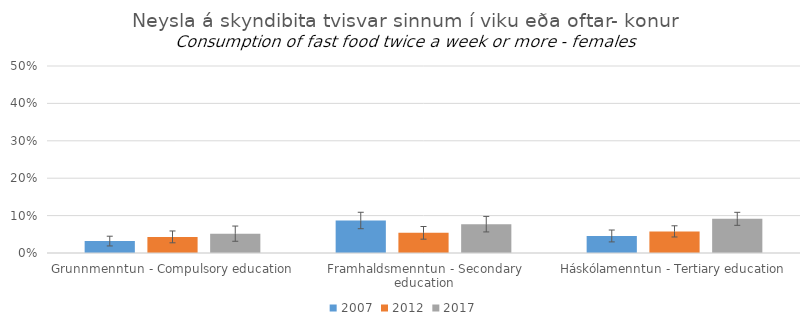
| Category | 2007 | 2012 | 2017 |
|---|---|---|---|
| Grunnmenntun - Compulsory education | 0.032 | 0.043 | 0.052 |
| Framhaldsmenntun - Secondary education | 0.087 | 0.054 | 0.077 |
| Háskólamenntun - Tertiary education | 0.046 | 0.058 | 0.091 |